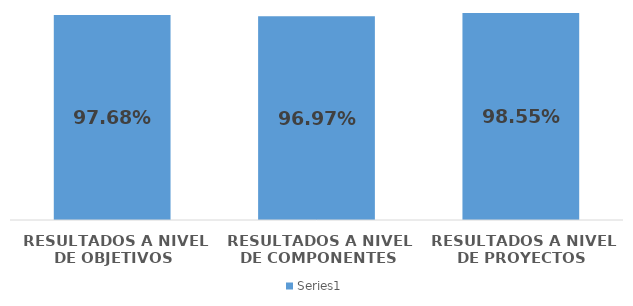
| Category | Series 0 |
|---|---|
| RESULTADOS A NIVEL DE OBJETIVOS | 0.977 |
| RESULTADOS A NIVEL DE COMPONENTES | 0.97 |
| RESULTADOS A NIVEL DE PROYECTOS | 0.986 |